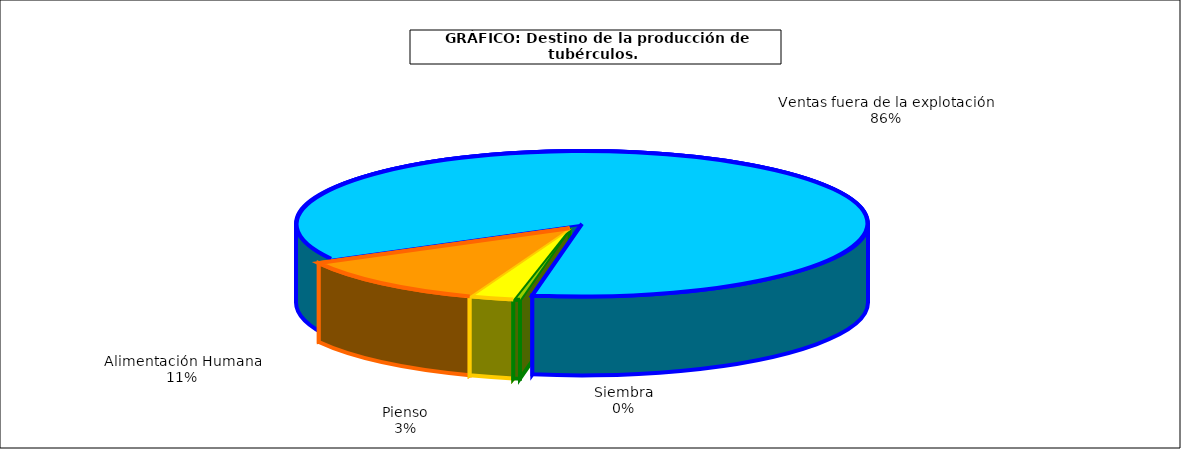
| Category | Series 0 |
|---|---|
| 0 | 7890 |
| 1 | 52489 |
| 2 | 235943 |
| 3 | 1783319 |